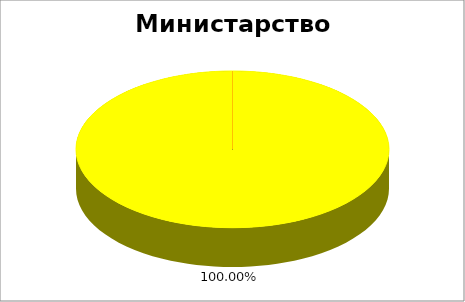
| Category | Министарство финансија |
|---|---|
| 0 | 0 |
| 1 | 0 |
| 2 | 1 |
| 3 | 0 |
| 4 | 0 |